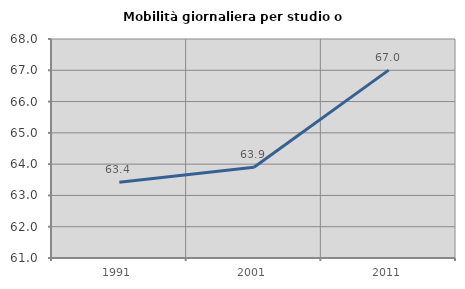
| Category | Mobilità giornaliera per studio o lavoro |
|---|---|
| 1991.0 | 63.421 |
| 2001.0 | 63.9 |
| 2011.0 | 67.005 |